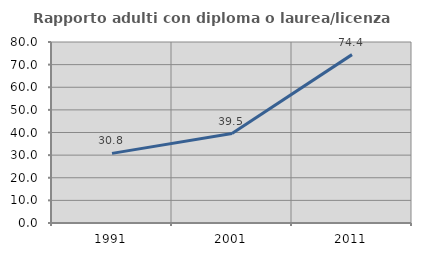
| Category | Rapporto adulti con diploma o laurea/licenza media  |
|---|---|
| 1991.0 | 30.769 |
| 2001.0 | 39.535 |
| 2011.0 | 74.419 |